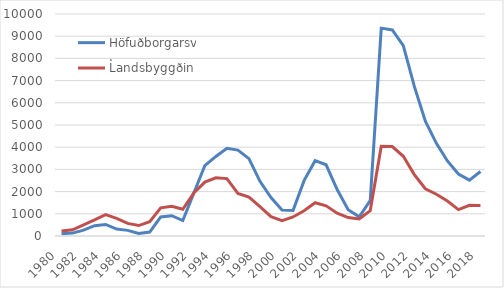
| Category | Höfuðborgarsv. | Landsbyggðin |
|---|---|---|
| 1980.0 | 101.107 | 230.205 |
| 1981.0 | 130.452 | 276.96 |
| 1982.0 | 263.822 | 505.155 |
| 1983.0 | 463.917 | 723 |
| 1984.0 | 519.417 | 961.25 |
| 1985.0 | 310.833 | 793.833 |
| 1986.0 | 253.167 | 569.667 |
| 1987.0 | 113.917 | 470.167 |
| 1988.0 | 176.833 | 642.75 |
| 1989.0 | 858.667 | 1266.5 |
| 1990.0 | 912.75 | 1342.583 |
| 1991.0 | 695.583 | 1204.917 |
| 1992.0 | 1932.75 | 1935.083 |
| 1993.0 | 3173.333 | 2428.083 |
| 1994.0 | 3584.333 | 2624.333 |
| 1995.0 | 3953.667 | 2584.75 |
| 1996.0 | 3871.75 | 1919.25 |
| 1997.0 | 3482.667 | 1747.75 |
| 1998.0 | 2462.5 | 1325.917 |
| 1999.0 | 1729.583 | 872.5 |
| 2000.0 | 1170 | 695 |
| 2001.0 | 1152 | 858 |
| 2002.0 | 2495 | 1135 |
| 2003.0 | 3394 | 1498 |
| 2004.0 | 3207 | 1357 |
| 2005.0 | 2093 | 1026 |
| 2006.0 | 1185 | 832 |
| 2007.0 | 861.917 | 770.333 |
| 2008.0 | 1600.167 | 1144.333 |
| 2009.0 | 9363.417 | 4043.333 |
| 2010.0 | 9281.167 | 4027.5 |
| 2011.0 | 8575.167 | 3592.167 |
| 2012.0 | 6739.333 | 2765.5 |
| 2013.0 | 5176 | 2128 |
| 2014.0 | 4172.833 | 1879.75 |
| 2015.0 | 3381.5 | 1573.583 |
| 2016.0 | 2790.667 | 1188.333 |
| 2017.0 | 2514.667 | 1384.333 |
| 2018.0 | 2904.25 | 1378.25 |